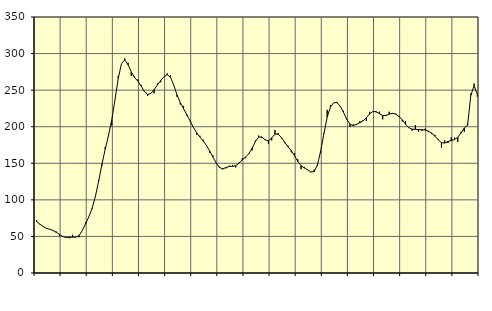
| Category | Piggar | Series 1 |
|---|---|---|
| nan | 72.2 | 70.2 |
| 87.0 | 66.4 | 66.82 |
| 87.0 | 63.4 | 63.47 |
| 87.0 | 60.5 | 61.09 |
| nan | 59.6 | 59.76 |
| 88.0 | 58 | 58.25 |
| 88.0 | 56.7 | 55.61 |
| 88.0 | 50.9 | 52.63 |
| nan | 49.6 | 49.89 |
| 89.0 | 49.3 | 48.65 |
| 89.0 | 47.6 | 48.89 |
| 89.0 | 52.2 | 49.01 |
| nan | 48.7 | 48.93 |
| 90.0 | 48.9 | 51.24 |
| 90.0 | 58 | 58.06 |
| 90.0 | 69.2 | 67.35 |
| nan | 76.8 | 76.92 |
| 91.0 | 87.7 | 88.49 |
| 91.0 | 105.3 | 104.83 |
| 91.0 | 127.1 | 125.73 |
| nan | 146.8 | 148.47 |
| 92.0 | 172 | 169.24 |
| 92.0 | 188.9 | 187.7 |
| 92.0 | 201.9 | 209.04 |
| nan | 236.8 | 237.04 |
| 93.0 | 269.5 | 266.18 |
| 93.0 | 286.3 | 286.27 |
| 93.0 | 293.3 | 291.33 |
| nan | 287.4 | 284.81 |
| 94.0 | 269.3 | 274.79 |
| 94.0 | 268.5 | 267.31 |
| 94.0 | 264.5 | 262.32 |
| nan | 257.2 | 255.71 |
| 95.0 | 247.8 | 248.13 |
| 95.0 | 242.1 | 243.94 |
| 95.0 | 245.7 | 245.47 |
| nan | 245.7 | 250.8 |
| 96.0 | 259.3 | 257.05 |
| 96.0 | 260.8 | 263.1 |
| 96.0 | 268.3 | 268.41 |
| nan | 273 | 271.07 |
| 97.0 | 270.1 | 267.63 |
| 97.0 | 256.9 | 256.92 |
| 97.0 | 241 | 243.66 |
| nan | 230.5 | 232.93 |
| 98.0 | 228.5 | 224.65 |
| 98.0 | 214.8 | 216.46 |
| 98.0 | 207.3 | 207.94 |
| nan | 199.4 | 199.22 |
| 99.0 | 189.2 | 191.87 |
| 99.0 | 187.6 | 185.97 |
| 99.0 | 182.2 | 180.61 |
| nan | 174 | 174.45 |
| 0.0 | 164.4 | 166.86 |
| 0.0 | 160.6 | 158.61 |
| 0.0 | 149.8 | 150.46 |
| nan | 145.3 | 144.3 |
| 1.0 | 141.7 | 142.51 |
| 1.0 | 143.1 | 144.13 |
| 1.0 | 146.6 | 145.79 |
| nan | 147.7 | 145.86 |
| 2.0 | 144.4 | 146.72 |
| 2.0 | 151 | 150.16 |
| 2.0 | 156.8 | 154.74 |
| nan | 157 | 158.65 |
| 3.0 | 163.5 | 162.96 |
| 3.0 | 167.7 | 170.47 |
| 3.0 | 181.1 | 179.65 |
| nan | 187.9 | 185.88 |
| 4.0 | 184.4 | 186 |
| 4.0 | 182.7 | 182.1 |
| 4.0 | 176.6 | 180.67 |
| nan | 181.3 | 184.71 |
| 5.0 | 195.4 | 189.71 |
| 5.0 | 191.3 | 189.88 |
| 5.0 | 184.1 | 185.09 |
| nan | 177.6 | 178.53 |
| 6.0 | 174 | 172.55 |
| 6.0 | 165 | 167.14 |
| 6.0 | 163.6 | 160.45 |
| nan | 155.4 | 152.64 |
| 7.0 | 142 | 146.74 |
| 7.0 | 145 | 143.57 |
| 7.0 | 141.4 | 141.03 |
| nan | 137.8 | 138.16 |
| 8.0 | 141.2 | 138.61 |
| 8.0 | 146.5 | 147.64 |
| 8.0 | 164.2 | 166.57 |
| nan | 191.5 | 190.65 |
| 9.0 | 223.1 | 213.2 |
| 9.0 | 229.6 | 226.84 |
| 9.0 | 232.9 | 232.85 |
| nan | 233.9 | 232.91 |
| 10.0 | 227.5 | 228.07 |
| 10.0 | 221.8 | 219.6 |
| 10.0 | 209.4 | 210.19 |
| nan | 199.7 | 203.49 |
| 11.0 | 203.2 | 201.55 |
| 11.0 | 202.4 | 203.4 |
| 11.0 | 207.6 | 205.46 |
| nan | 208.8 | 207.88 |
| 12.0 | 207.8 | 212.4 |
| 12.0 | 220.3 | 217.37 |
| 12.0 | 220.7 | 220.78 |
| nan | 219.6 | 220.61 |
| 13.0 | 220.6 | 217.74 |
| 13.0 | 210 | 215.42 |
| 13.0 | 216.1 | 215.36 |
| nan | 220.4 | 217.17 |
| 14.0 | 217.4 | 218.3 |
| 14.0 | 217.9 | 217.08 |
| 14.0 | 213.4 | 214.2 |
| nan | 207.2 | 209.41 |
| 15.0 | 207.4 | 203.43 |
| 15.0 | 198.4 | 198.64 |
| 15.0 | 194.4 | 196.65 |
| nan | 202.1 | 196.42 |
| 16.0 | 193.3 | 196.11 |
| 16.0 | 194.3 | 195.84 |
| 16.0 | 197.3 | 195.53 |
| nan | 192.5 | 194.03 |
| 17.0 | 189.9 | 191.26 |
| 17.0 | 188.9 | 187.14 |
| 17.0 | 183 | 182.08 |
| nan | 171.5 | 178.16 |
| 18.0 | 181.2 | 177.67 |
| 18.0 | 177.7 | 179.7 |
| 18.0 | 185.6 | 181.12 |
| nan | 185.2 | 182.43 |
| 19.0 | 179.4 | 185.61 |
| 19.0 | 192.9 | 191.34 |
| 19.0 | 193.2 | 198.26 |
| nan | 204.2 | 202.05 |
| 20.0 | 245.4 | 243.07 |
| 20.0 | 259 | 255.89 |
| 20.0 | 241.3 | 243.85 |